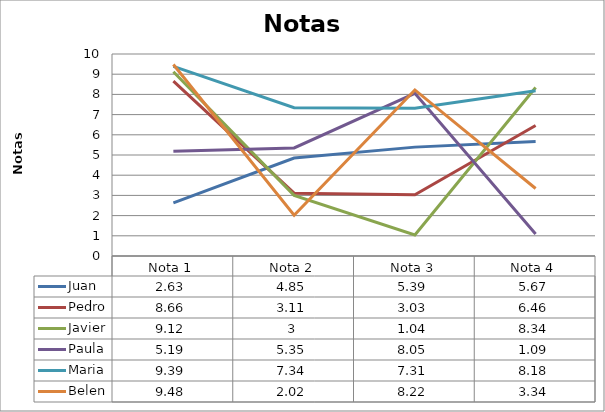
| Category | Juan  | Pedro  | Javier  | Paula | Maria | Belen |
|---|---|---|---|---|---|---|
| Nota 1 | 2.63 | 8.66 | 9.12 | 5.19 | 9.39 | 9.48 |
| Nota 2 | 4.85 | 3.11 | 3 | 5.35 | 7.34 | 2.02 |
| Nota 3 | 5.39 | 3.03 | 1.04 | 8.05 | 7.31 | 8.22 |
| Nota 4 | 5.67 | 6.46 | 8.34 | 1.09 | 8.18 | 3.34 |